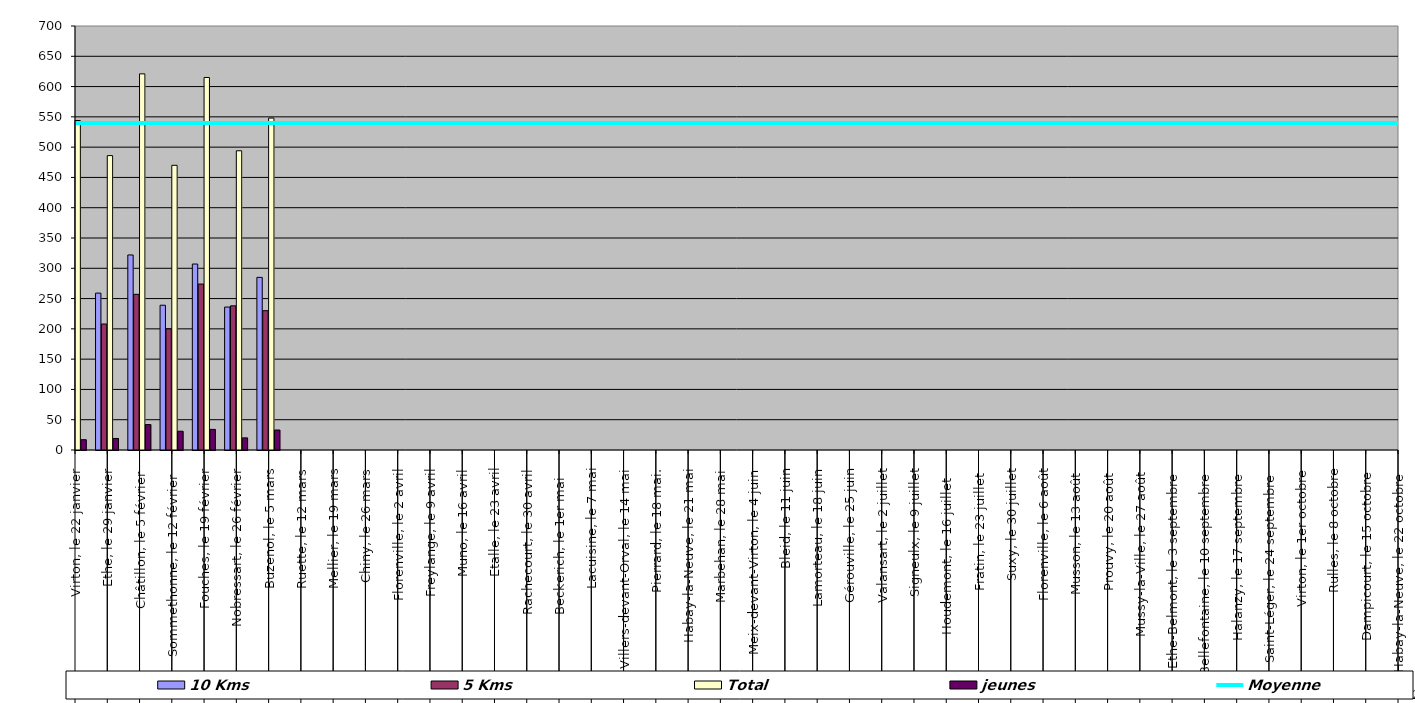
| Category | 10 Kms | 5 Kms | Total | jeunes |
|---|---|---|---|---|
| 0 | 296 | 231 | 544 | 17 |
| 1 | 259 | 208 | 486 | 19 |
| 2 | 322 | 257 | 621 | 42 |
| 3 | 239 | 200 | 470 | 31 |
| 4 | 307 | 274 | 615 | 34 |
| 5 | 236 | 238 | 494 | 20 |
| 6 | 285 | 230 | 548 | 33 |
| 7 | 0 | 0 | 0 | 0 |
| 8 | 0 | 0 | 0 | 0 |
| 9 | 0 | 0 | 0 | 0 |
| 10 | 0 | 0 | 0 | 0 |
| 11 | 0 | 0 | 0 | 0 |
| 12 | 0 | 0 | 0 | 0 |
| 13 | 0 | 0 | 0 | 0 |
| 14 | 0 | 0 | 0 | 0 |
| 15 | 0 | 0 | 0 | 0 |
| 16 | 0 | 0 | 0 | 0 |
| 17 | 0 | 0 | 0 | 0 |
| 18 | 0 | 0 | 0 | 0 |
| 19 | 0 | 0 | 0 | 0 |
| 20 | 0 | 0 | 0 | 0 |
| 21 | 0 | 0 | 0 | 0 |
| 22 | 0 | 0 | 0 | 0 |
| 23 | 0 | 0 | 0 | 0 |
| 24 | 0 | 0 | 0 | 0 |
| 25 | 0 | 0 | 0 | 0 |
| 26 | 0 | 0 | 0 | 0 |
| 27 | 0 | 0 | 0 | 0 |
| 28 | 0 | 0 | 0 | 0 |
| 29 | 0 | 0 | 0 | 0 |
| 30 | 0 | 0 | 0 | 0 |
| 31 | 0 | 0 | 0 | 0 |
| 32 | 0 | 0 | 0 | 0 |
| 33 | 0 | 0 | 0 | 0 |
| 34 | 0 | 0 | 0 | 0 |
| 35 | 0 | 0 | 0 | 0 |
| 36 | 0 | 0 | 0 | 0 |
| 37 | 0 | 0 | 0 | 0 |
| 38 | 0 | 0 | 0 | 0 |
| 39 | 0 | 0 | 0 | 0 |
| 40 | 0 | 0 | 0 | 0 |
| 41 | 0 | 0 | 0 | 0 |